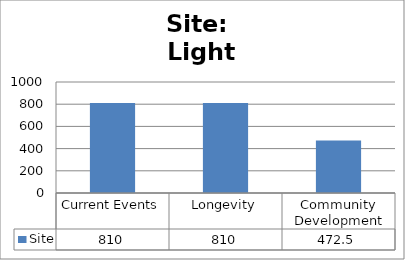
| Category | Site |
|---|---|
| Current Events | 810 |
| Longevity | 810 |
| Community Development | 472.5 |